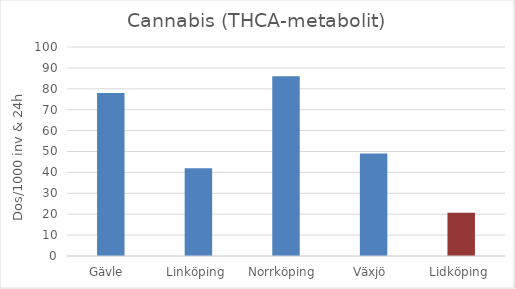
| Category | Cannabis (THCA-metabolit) |
|---|---|
| Gävle  | 78 |
| Linköping  | 42 |
| Norrköping  | 86 |
| Växjö  | 49 |
| Lidköping  | 20.733 |